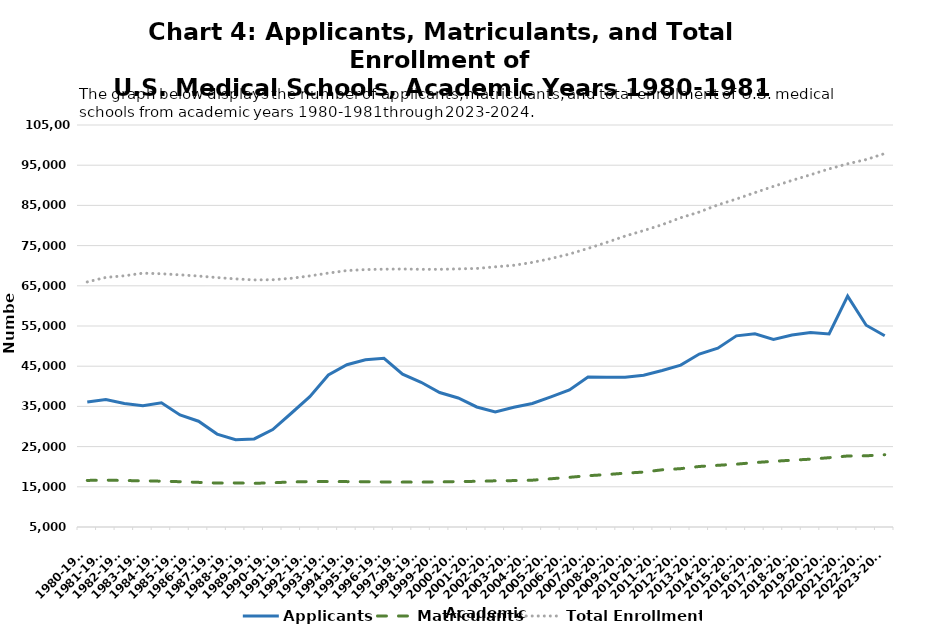
| Category | Applicants | Matriculants | Total Enrollment |
|---|---|---|---|
| 1980-1981 | 36083 | 16587 | 65969 |
| 1981-1982 | 36717 | 16660 | 67087 |
| 1982-1983 | 35719 | 16567 | 67493 |
| 1983-1984 | 35187 | 16480 | 68140 |
| 1984-1985 | 35917 | 16395 | 67994 |
| 1985-1986 | 32885 | 16268 | 67726 |
| 1986-1987 | 31313 | 16103 | 67429 |
| 1987-1988 | 28118 | 15927 | 67049 |
| 1988-1989 | 26702 | 15969 | 66717 |
| 1989-1990 | 26909 | 15867 | 66461 |
| 1990-1991 | 29241 | 15998 | 66509 |
| 1991-1992 | 33296 | 16211 | 66865 |
| 1992-1993 | 37402 | 16289 | 67459 |
| 1993-1994 | 42806 | 16307 | 68163 |
| 1994-1995 | 45360 | 16287 | 68789 |
| 1995-1996 | 46586 | 16252 | 69034 |
| 1996-1997 | 46965 | 16201 | 69135 |
| 1997-1998 | 43016 | 16164 | 69180 |
| 1998-1999 | 40995 | 16170 | 69100 |
| 1999-2000 | 38442 | 16221 | 69099 |
| 2000-2001 | 37088 | 16301 | 69206 |
| 2001-2002 | 34860 | 16365 | 69313 |
| 2002-2003 | 33623 | 16488 | 69718 |
| 2003-2004 | 34791 | 16541 | 70104 |
| 2004-2005 | 35735 | 16648 | 70819 |
| 2005-2006 | 37371 | 17003 | 71777 |
| 2006-2007 | 39108 | 17361 | 72893 |
| 2007-2008 | 42315 | 17759 | 74296 |
| 2008-2009 | 42231 | 18036 | 75777 |
| 2009-2010 | 42268 | 18390 | 77367 |
| 2010-2011 | 42741 | 18665 | 78740 |
| 2011-2012 | 43919 | 19230 | 80204 |
| 2012-2013 | 45266 | 19517 | 81932 |
| 2013-2014 | 48014 | 20055 | 83351 |
| 2014-2015 | 49480 | 20343 | 85122 |
| 2015-2016 | 52549 | 20631 | 86583 |
| 2016-2017 | 53042 | 21030 | 88177 |
| 2017-2018 | 51680 | 21338 | 89729 |
| 2018-2019 | 52777 | 21622 | 91221 |
| 2019-2020 | 53369 | 21869 | 92626 |
| 2020-2021 | 53030 | 22239 | 94074 |
| 2021-2022 | 62443 | 22666 | 95347 |
| 2022-2023 | 55189 | 22710 | 96405 |
| 2023-2024 | 52577 | 22981 | 97903 |